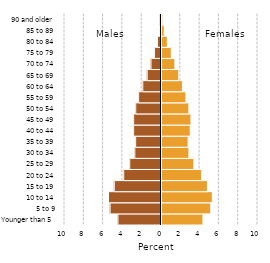
| Category | Female |
|---|---|
| Younger than 5 | 4.296 |
| 5 to 9 | 5.104 |
| 10 to 14 | 5.265 |
| 15 to 19 | 4.761 |
| 20 to 24 | 4.16 |
| 25 to 29 | 3.352 |
| 30 to 34 | 2.843 |
| 35 to 39 | 2.76 |
| 40 to 44 | 2.979 |
| 45 to 49 | 3.054 |
| 50 to 54 | 2.838 |
| 55 to 59 | 2.528 |
| 60 to 64 | 2.167 |
| 65 to 69 | 1.788 |
| 70 to 74 | 1.39 |
| 75 to 79 | 1.012 |
| 80 to 84 | 0.606 |
| 85 to 89 | 0.284 |
| 90 and older | 0.136 |